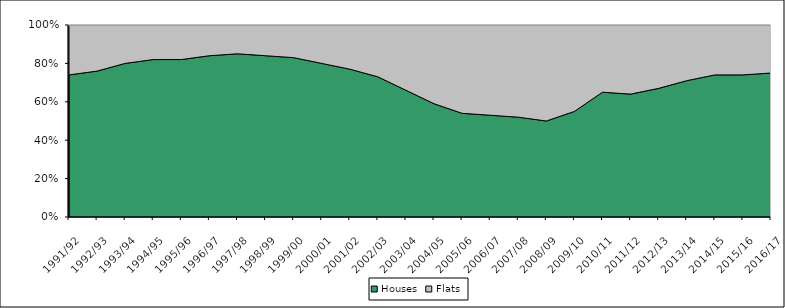
| Category | Houses | Flats |
|---|---|---|
| 1991/92 | 74 | 26 |
| 1992/93 | 76 | 24 |
| 1993/94 | 80 | 20 |
| 1994/95 | 82 | 18 |
| 1995/96 | 82 | 18 |
| 1996/97 | 84 | 16 |
| 1997/98 | 85 | 15 |
| 1998/99 | 84 | 16 |
| 1999/00 | 83 | 17 |
| 2000/01 | 80 | 20 |
| 2001/02 | 77 | 23 |
| 2002/03 | 73 | 27 |
| 2003/04 | 66 | 34 |
| 2004/05 | 59 | 41 |
| 2005/06 | 54 | 46 |
| 2006/07 | 53 | 47 |
| 2007/08 | 52 | 48 |
| 2008/09 | 50 | 50 |
| 2009/10 | 55 | 45 |
| 2010/11 | 65 | 35 |
| 2011/12 | 64 | 36 |
| 2012/13 | 67 | 33 |
| 2013/14 | 71 | 29 |
| 2014/15 | 74 | 26 |
| 2015/16 | 74 | 26 |
| 2016/17 | 75 | 25 |